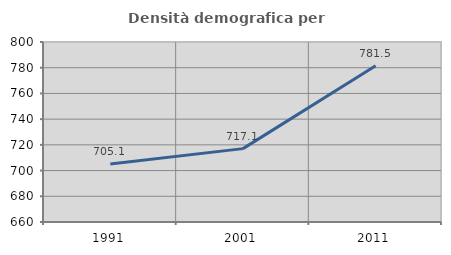
| Category | Densità demografica |
|---|---|
| 1991.0 | 705.085 |
| 2001.0 | 717.067 |
| 2011.0 | 781.472 |